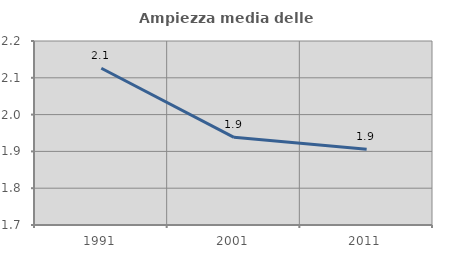
| Category | Ampiezza media delle famiglie |
|---|---|
| 1991.0 | 2.126 |
| 2001.0 | 1.938 |
| 2011.0 | 1.906 |